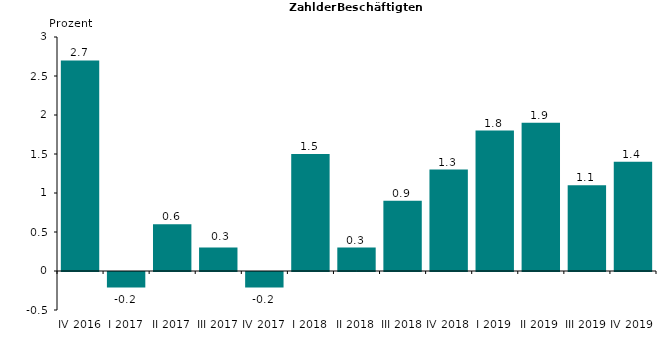
| Category | 2,7 |
|---|---|
| IV 2016 | 2.7 |
| I 2017 | -0.2 |
| II 2017 | 0.6 |
| III 2017 | 0.3 |
| IV 2017 | -0.2 |
| I 2018 | 1.5 |
| II 2018 | 0.3 |
| III 2018 | 0.9 |
| IV 2018 | 1.3 |
| I 2019 | 1.8 |
| II 2019 | 1.9 |
| III 2019 | 1.1 |
| IV 2019 | 1.4 |